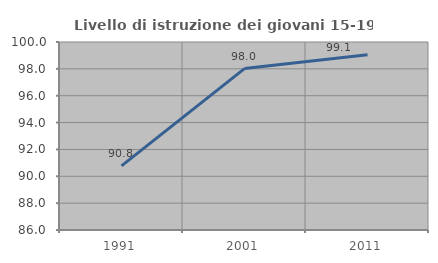
| Category | Livello di istruzione dei giovani 15-19 anni |
|---|---|
| 1991.0 | 90.78 |
| 2001.0 | 98.02 |
| 2011.0 | 99.057 |